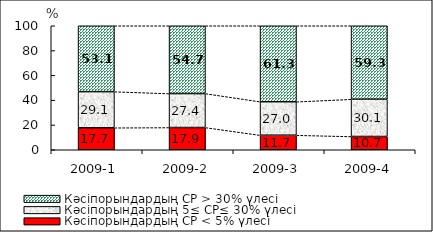
| Category | Кәсіпорындардың СР < 5% үлесі | Кәсіпорындардың 5≤ СР≤ 30% үлесі | Кәсіпорындардың СР > 30% үлесі |
|---|---|---|---|
| 2009-1 | 17.736 | 29.133 | 53.13 |
| 2009-2 | 17.928 | 27.377 | 54.695 |
| 2009-3 | 11.736 | 27.006 | 61.258 |
| 2009-4 | 10.696 | 30.051 | 59.253 |